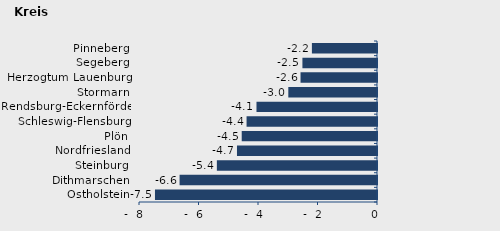
| Category | Überschuss der Geborenen (+) bzw. Gestorbenen (-) |
|---|---|
| Ostholstein | -7.463 |
| Dithmarschen | -6.636 |
| Steinburg | -5.383 |
| Nordfriesland | -4.707 |
| Plön | -4.547 |
| Schleswig-Flensburg | -4.384 |
| Rendsburg-Eckernförde | -4.051 |
| Stormarn | -2.981 |
| Herzogtum Lauenburg | -2.57 |
| Segeberg | -2.507 |
| Pinneberg | -2.188 |